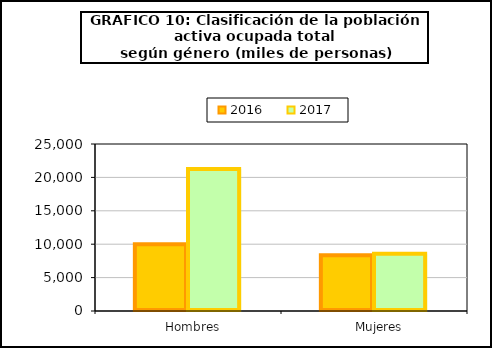
| Category | 2016 | 2017 |
|---|---|---|
|    Hombres | 10000.8 | 21266.3 |
|    Mujeres | 8340.8 | 8558.5 |